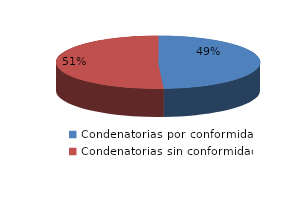
| Category | Series 0 |
|---|---|
| 0 | 85 |
| 1 | 88 |